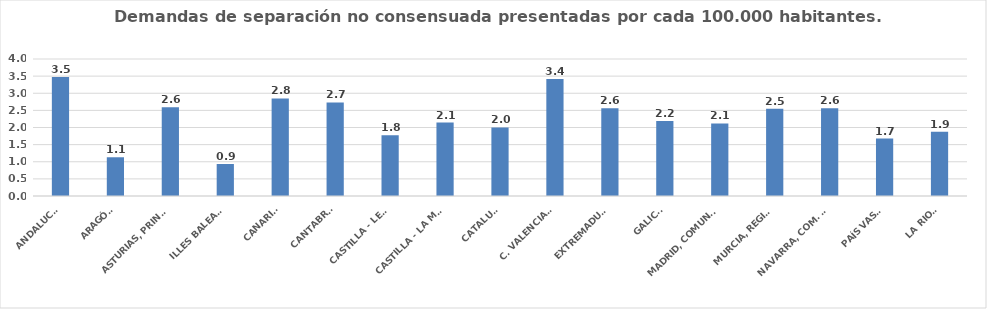
| Category | Series 0 |
|---|---|
| ANDALUCÍA | 3.472 |
| ARAGÓN | 1.131 |
| ASTURIAS, PRINCIPADO | 2.588 |
| ILLES BALEARS | 0.935 |
| CANARIAS | 2.847 |
| CANTABRIA | 2.733 |
| CASTILLA - LEÓN | 1.77 |
| CASTILLA - LA MANCHA | 2.143 |
| CATALUÑA | 2.002 |
| C. VALENCIANA | 3.413 |
| EXTREMADURA | 2.56 |
| GALICIA | 2.193 |
| MADRID, COMUNIDAD | 2.118 |
| MURCIA, REGIÓN | 2.546 |
| NAVARRA, COM. FORAL | 2.56 |
| PAÍS VASCO | 1.676 |
| LA RIOJA | 1.876 |